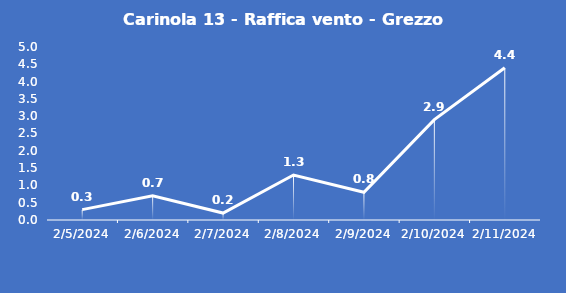
| Category | Carinola 13 - Raffica vento - Grezzo (m/s) |
|---|---|
| 2/5/24 | 0.3 |
| 2/6/24 | 0.7 |
| 2/7/24 | 0.2 |
| 2/8/24 | 1.3 |
| 2/9/24 | 0.8 |
| 2/10/24 | 2.9 |
| 2/11/24 | 4.4 |